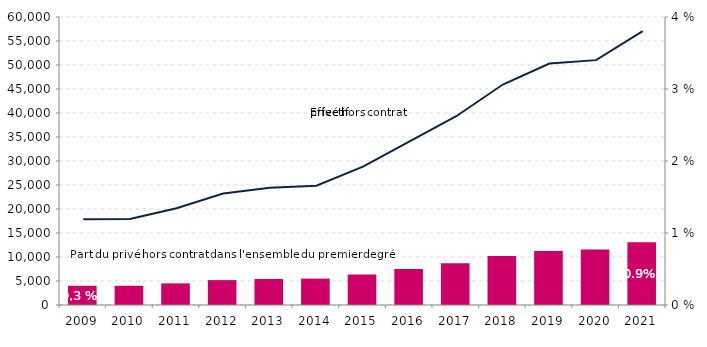
| Category | Part |
|---|---|
| 2009 | 0.003 |
| 2010 | 0.003 |
| 2011 | 0.003 |
| 2012 | 0.003 |
| 2013 | 0.004 |
| 2014 | 0.004 |
| 2015 | 0.004 |
| 2016 | 0.005 |
| 2017 | 0.006 |
| 2018 | 0.007 |
| 2019 | 0.008 |
| 2020 | 0.008 |
| 2021 | 0.009 |